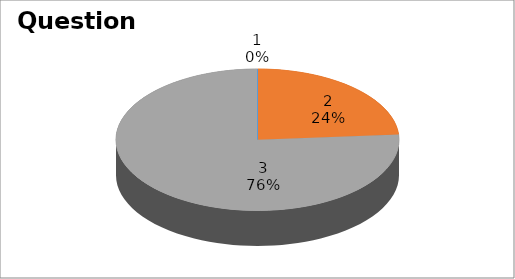
| Category | Series 0 |
|---|---|
| 0 | 0 |
| 1 | 5 |
| 2 | 16 |